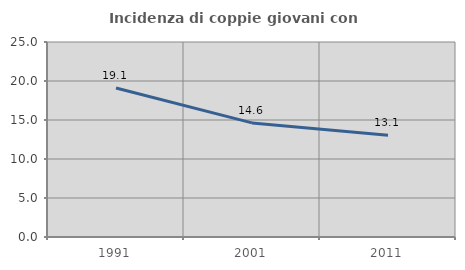
| Category | Incidenza di coppie giovani con figli |
|---|---|
| 1991.0 | 19.11 |
| 2001.0 | 14.626 |
| 2011.0 | 13.054 |